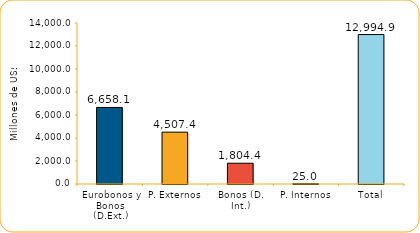
| Category | Series 1 |
|---|---|
| Eurobonos y Bonos (D.Ext.) | 6658.1 |
| P. Externos | 4507.4 |
| Bonos (D. Int.) | 1804.4 |
| P. Internos | 25 |
| Total | 12994.9 |